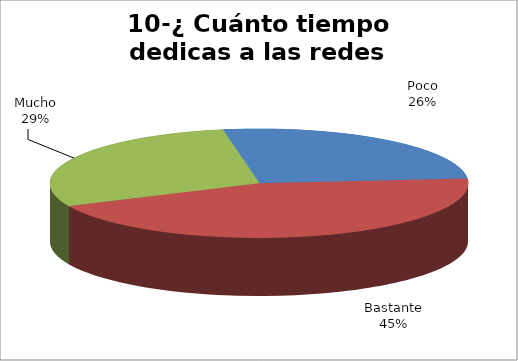
| Category | Series 0 |
|---|---|
| Poco | 87 |
| Bastante | 147 |
| Mucho | 96 |